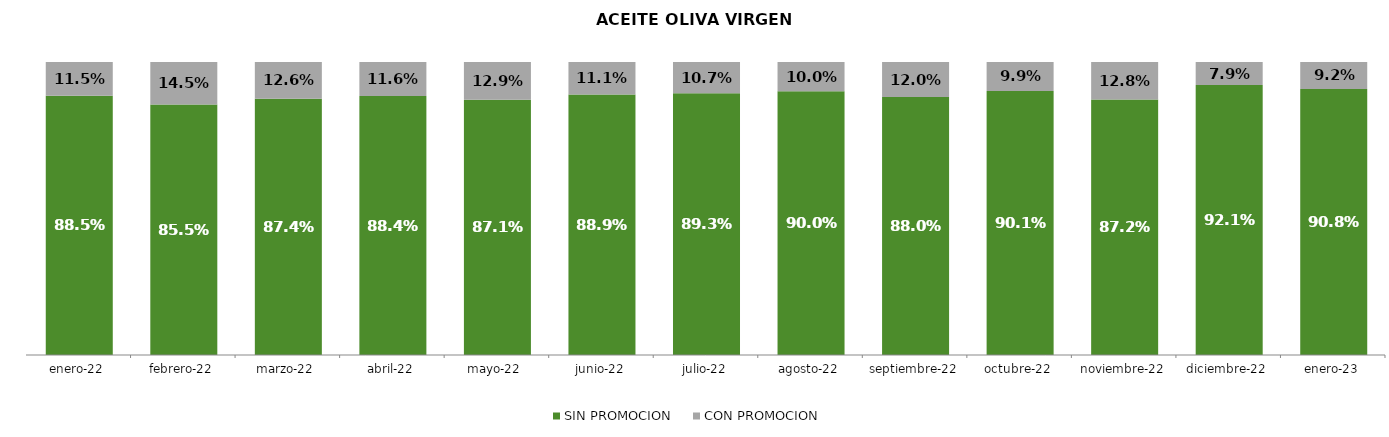
| Category | SIN PROMOCION   | CON PROMOCION   |
|---|---|---|
| 2022-01-01 | 0.885 | 0.115 |
| 2022-02-01 | 0.855 | 0.145 |
| 2022-03-01 | 0.874 | 0.126 |
| 2022-04-01 | 0.884 | 0.116 |
| 2022-05-01 | 0.871 | 0.129 |
| 2022-06-01 | 0.889 | 0.111 |
| 2022-07-01 | 0.893 | 0.107 |
| 2022-08-01 | 0.9 | 0.1 |
| 2022-09-01 | 0.88 | 0.12 |
| 2022-10-01 | 0.901 | 0.099 |
| 2022-11-01 | 0.872 | 0.128 |
| 2022-12-01 | 0.921 | 0.079 |
| 2023-01-01 | 0.908 | 0.092 |